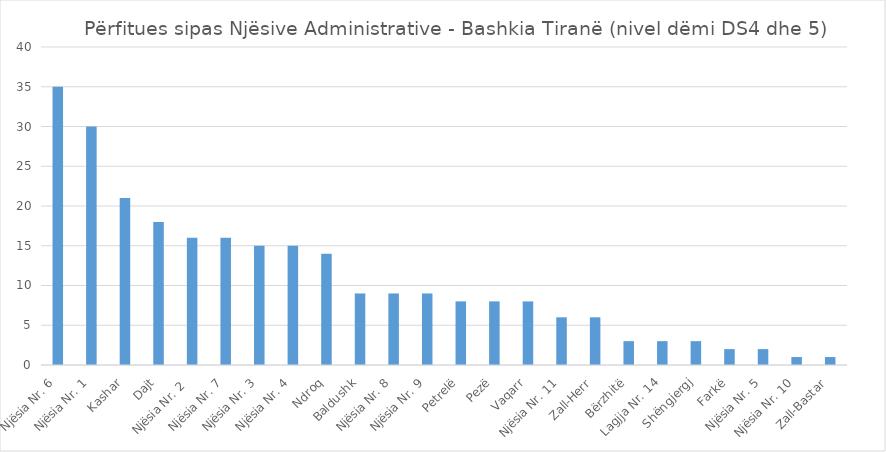
| Category | Nr. i Subjekteve Përfitues |
|---|---|
| Njësia Nr. 6 | 35 |
| Njësia Nr. 1 | 30 |
| Kashar | 21 |
| Dajt | 18 |
| Njësia Nr. 2  | 16 |
| Njësia Nr. 7 | 16 |
| Njësia Nr. 3 | 15 |
| Njësia Nr. 4 | 15 |
| Ndroq | 14 |
| Baldushk | 9 |
| Njësia Nr. 8 | 9 |
| Njësia Nr. 9 | 9 |
| Petrelë | 8 |
| Pezë | 8 |
| Vaqarr | 8 |
| Njësia Nr. 11 | 6 |
| Zall-Herr | 6 |
| Bërzhitë | 3 |
| Lagjja Nr. 14 | 3 |
| Shëngjergj | 3 |
| Farkë | 2 |
| Njësia Nr. 5 | 2 |
| Njësia Nr. 10 | 1 |
| Zall-Bastar | 1 |